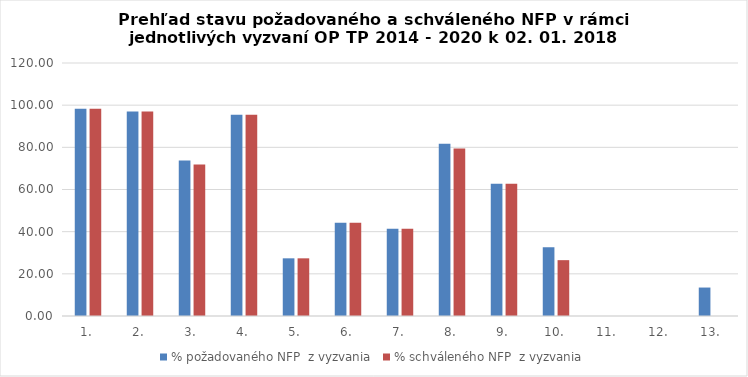
| Category | % požadovaného NFP  z vyzvania | % schváleného NFP  z vyzvania |
|---|---|---|
| 1. | 98.301 | 98.301 |
| 2. | 97.051 | 97.051 |
| 3. | 73.793 | 71.823 |
| 4. | 95.427 | 95.427 |
| 5. | 27.354 | 27.354 |
| 6. | 44.177 | 44.177 |
| 7. | 41.419 | 41.419 |
| 8. | 81.742 | 79.445 |
| 9. | 62.721 | 62.721 |
| 10. | 32.567 | 26.487 |
| 11. | 0 | 0 |
| 12. | 0 | 0 |
| 13. | 13.497 | 0 |